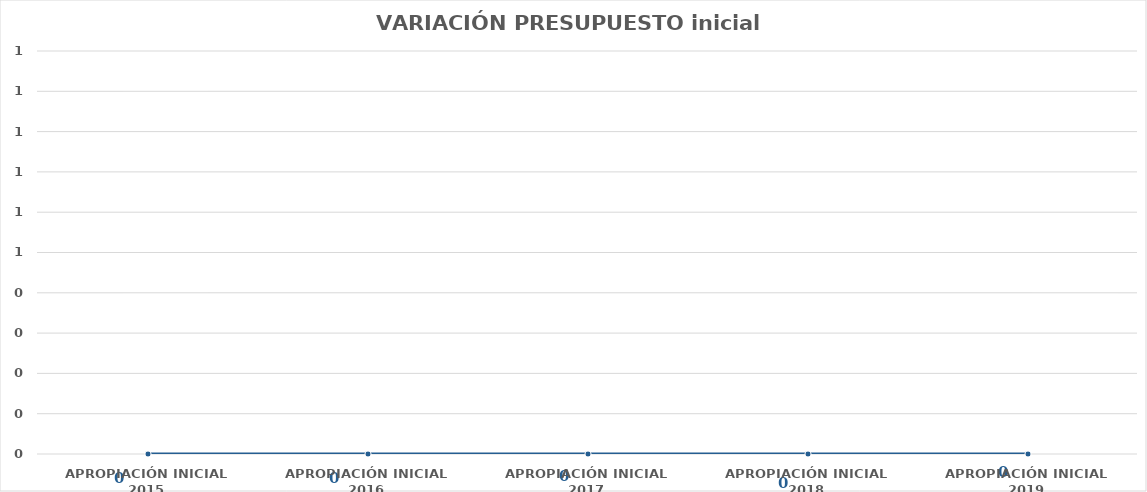
| Category | TOTAL GASTOS VIGENCIA |
|---|---|
| APROPIACIÓN INICIAL 2015 | 0 |
| APROPIACIÓN INICIAL 2016 | 0 |
| APROPIACIÓN INICIAL 2017 | 0 |
| APROPIACIÓN INICIAL 2018 | 0 |
| APROPIACIÓN INICIAL 2019 | 0 |